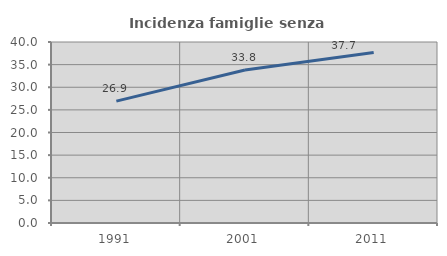
| Category | Incidenza famiglie senza nuclei |
|---|---|
| 1991.0 | 26.942 |
| 2001.0 | 33.828 |
| 2011.0 | 37.656 |